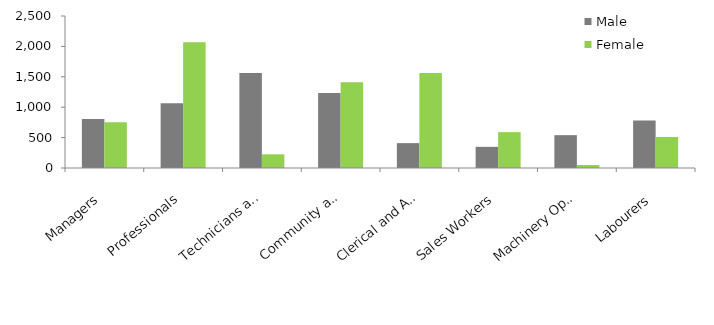
| Category | Male | Female |
|---|---|---|
| Managers | 807 | 752 |
| Professionals | 1064 | 2067 |
| Technicians and Trades Workers | 1561 | 225 |
| Community and Personal Service Workers | 1232 | 1411 |
| Clerical and Administrative Workers | 409 | 1561 |
| Sales Workers | 348 | 590 |
| Machinery Operators and Drivers | 540 | 49 |
| Labourers | 781 | 510 |